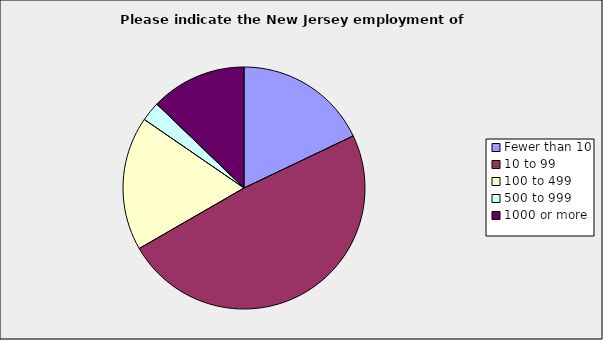
| Category | Series 0 |
|---|---|
| Fewer than 10 | 0.179 |
| 10 to 99 | 0.487 |
| 100 to 499 | 0.179 |
| 500 to 999 | 0.026 |
| 1000 or more | 0.128 |